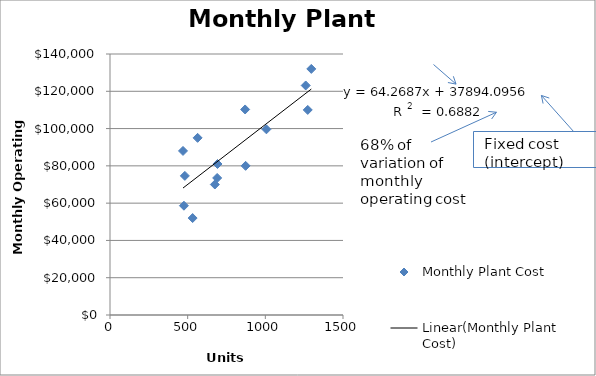
| Category | Monthly Plant Cost |
|---|---|
| 1260.0 | 123118 |
| 1007.0 | 99601 |
| 1296.0 | 132000 |
| 873.0 | 80000 |
| 532.0 | 52000 |
| 476.0 | 58625 |
| 482.0 | 74624 |
| 1273.0 | 110000 |
| 692.0 | 81000 |
| 690.0 | 73507 |
| 564.0 | 95024 |
| 470.0 | 88004 |
| 675.0 | 70000 |
| 870.0 | 110253 |